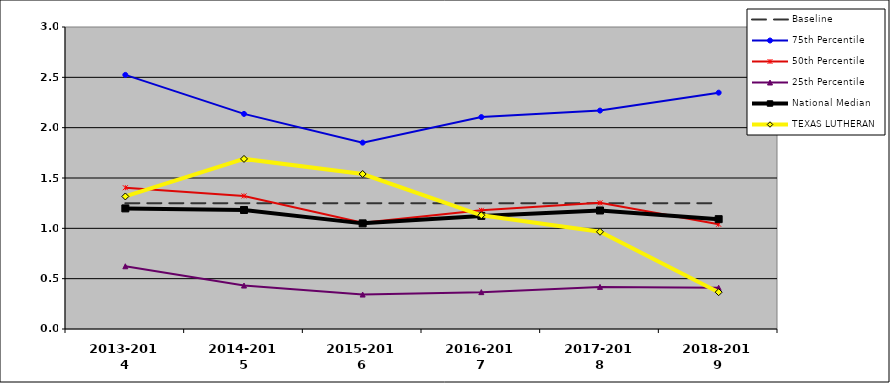
| Category | Baseline | 75th Percentile | 50th Percentile | 25th Percentile | National Median | TEXAS LUTHERAN |
|---|---|---|---|---|---|---|
| 2013-2014 | 1.25 | 2.524 | 1.403 | 0.623 | 1.198 | 1.317 |
| 2014-2015 | 1.25 | 2.137 | 1.322 | 0.432 | 1.182 | 1.69 |
| 2015-2016 | 1.25 | 1.851 | 1.057 | 0.342 | 1.049 | 1.54 |
| 2016-2017 | 1.25 | 2.105 | 1.179 | 0.366 | 1.123 | 1.13 |
| 2017-2018 | 1.25 | 2.17 | 1.253 | 0.418 | 1.177 | 0.966 |
| 2018-2019 | 1.25 | 2.348 | 1.04 | 0.409 | 1.091 | 0.366 |